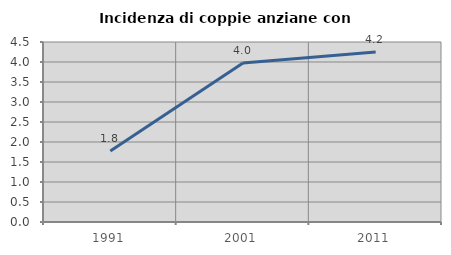
| Category | Incidenza di coppie anziane con figli |
|---|---|
| 1991.0 | 1.776 |
| 2001.0 | 3.977 |
| 2011.0 | 4.25 |